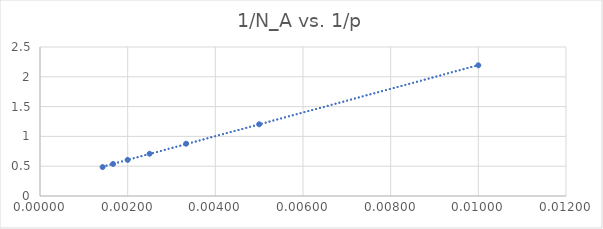
| Category | Series 0 |
|---|---|
| 0.01 | 2.193 |
| 0.005 | 1.203 |
| 0.0033333333333333335 | 0.877 |
| 0.0025 | 0.709 |
| 0.002 | 0.606 |
| 0.0016666666666666668 | 0.538 |
| 0.0014285714285714286 | 0.485 |